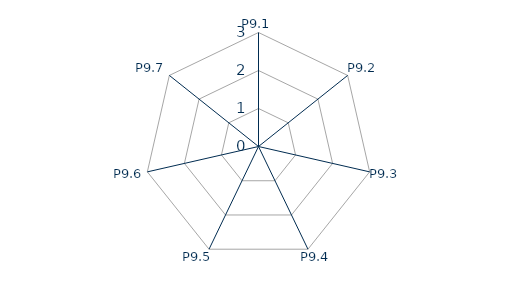
| Category | Series 0 |
|---|---|
| P9.1 | 0 |
| P9.2 | 0 |
| P9.3 | 0 |
| P9.4 | 0 |
| P9.5 | 0 |
| P9.6 | 0 |
| P9.7 | 0 |